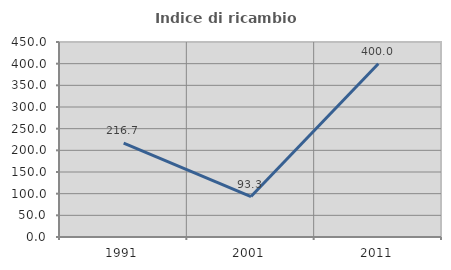
| Category | Indice di ricambio occupazionale  |
|---|---|
| 1991.0 | 216.667 |
| 2001.0 | 93.333 |
| 2011.0 | 400 |